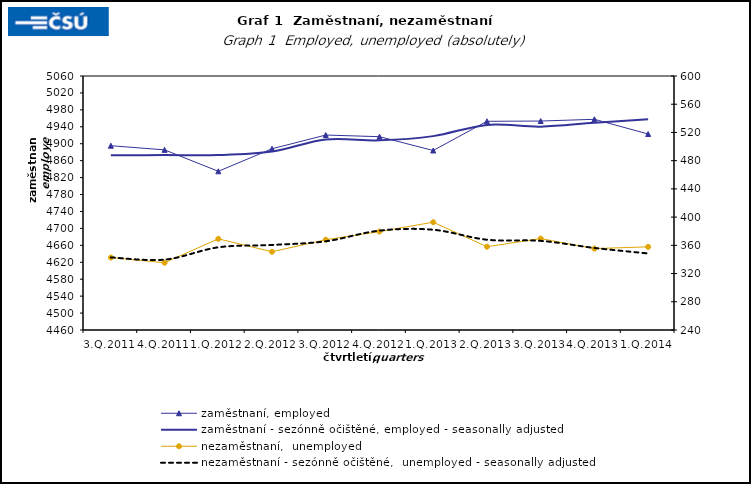
| Category | zaměstnaní, employed | zaměstnaní - sezónně očištěné, employed - seasonally adjusted |
|---|---|---|
| 3.Q.2011 | 4895.344 | 4872.667 |
| 4.Q.2011 | 4885.495 | 4873.113 |
| 1.Q.2012 | 4834.893 | 4873.097 |
| 2.Q.2012 | 4888.134 | 4881.498 |
| 3.Q.2012 | 4920.551 | 4910.031 |
| 4.Q.2012 | 4916.635 | 4908.006 |
| 1.Q.2013 | 4884.025 | 4917.96 |
| 2.Q.2013 | 4952.991 | 4944.415 |
| 3.Q.2013 | 4953.606 | 4940.372 |
| 4.Q.2013 | 4957.713 | 4949.442 |
| 1.Q.2014 | 4922.963 | 4957.598 |